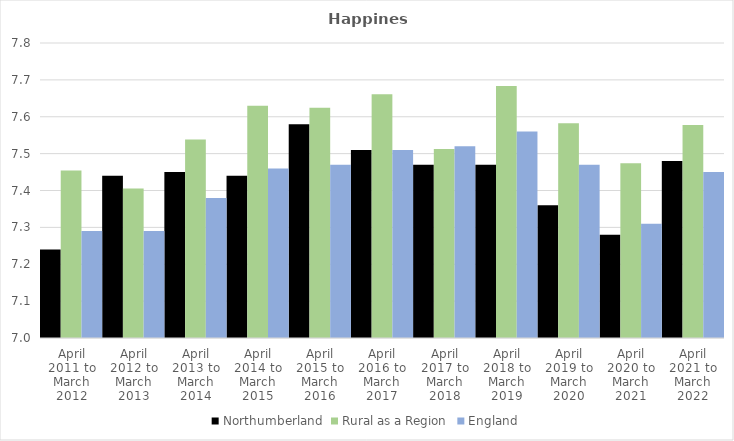
| Category | Northumberland | Rural as a Region | England |
|---|---|---|---|
| April 2011 to March 2012 | 7.24 | 7.454 | 7.29 |
| April 2012 to March 2013 | 7.44 | 7.406 | 7.29 |
| April 2013 to March 2014 | 7.45 | 7.539 | 7.38 |
| April 2014 to March 2015 | 7.44 | 7.63 | 7.46 |
| April 2015 to March 2016 | 7.58 | 7.625 | 7.47 |
| April 2016 to March 2017 | 7.51 | 7.661 | 7.51 |
| April 2017 to March 2018 | 7.47 | 7.513 | 7.52 |
| April 2018 to March 2019 | 7.47 | 7.684 | 7.56 |
| April 2019 to March 2020 | 7.36 | 7.582 | 7.47 |
| April 2020 to March 2021 | 7.28 | 7.474 | 7.31 |
| April 2021 to March 2022 | 7.48 | 7.577 | 7.45 |